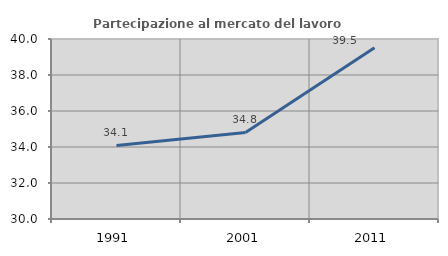
| Category | Partecipazione al mercato del lavoro  femminile |
|---|---|
| 1991.0 | 34.087 |
| 2001.0 | 34.808 |
| 2011.0 | 39.516 |